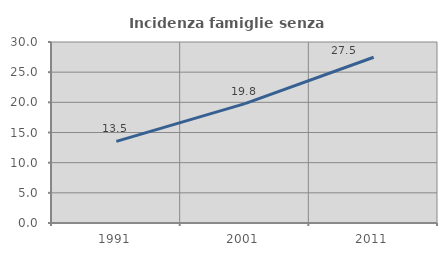
| Category | Incidenza famiglie senza nuclei |
|---|---|
| 1991.0 | 13.53 |
| 2001.0 | 19.791 |
| 2011.0 | 27.476 |